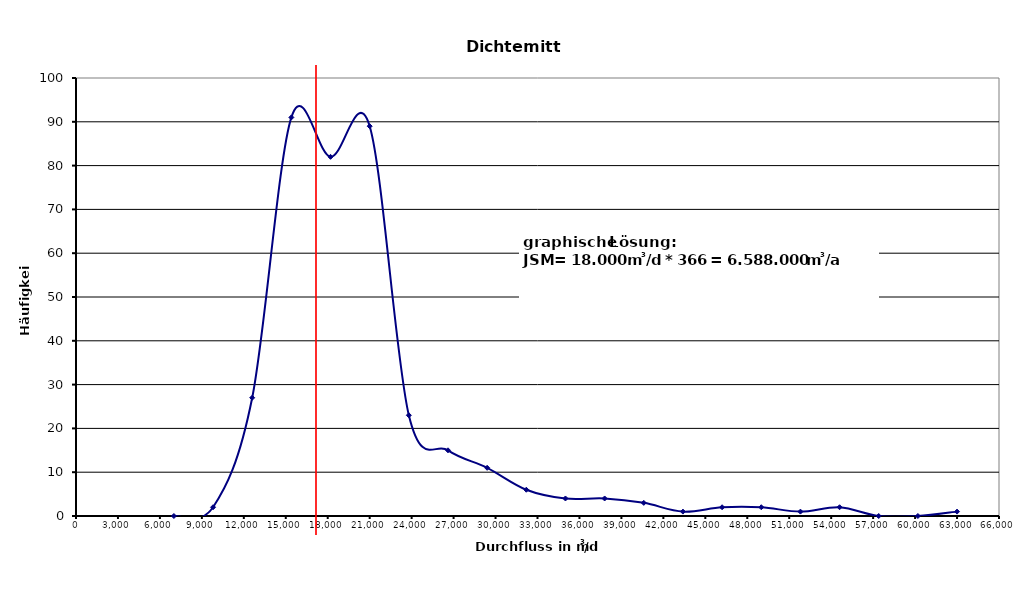
| Category | Series 0 |
|---|---|
| 7000.0 | 0 |
| 9800.0 | 2 |
| 12600.0 | 27 |
| 15400.0 | 91 |
| 18200.0 | 82 |
| 21000.0 | 89 |
| 23800.0 | 23 |
| 26600.0 | 15 |
| 29400.0 | 11 |
| 32200.0 | 6 |
| 35000.0 | 4 |
| 37800.0 | 4 |
| 40600.0 | 3 |
| 43400.0 | 1 |
| 46200.0 | 2 |
| 49000.0 | 2 |
| 51800.0 | 1 |
| 54600.0 | 2 |
| 57400.0 | 0 |
| 60200.0 | 0 |
| 63000.0 | 1 |